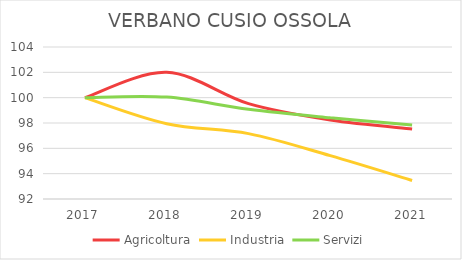
| Category | Agricoltura | Industria | Servizi |
|---|---|---|---|
| 2017.0 | 100 | 100 | 100 |
| 2018.0 | 102 | 97.945 | 100.045 |
| 2019.0 | 99.529 | 97.162 | 99.078 |
| 2020.0 | 98.235 | 95.421 | 98.409 |
| 2021.0 | 97.529 | 93.464 | 97.849 |